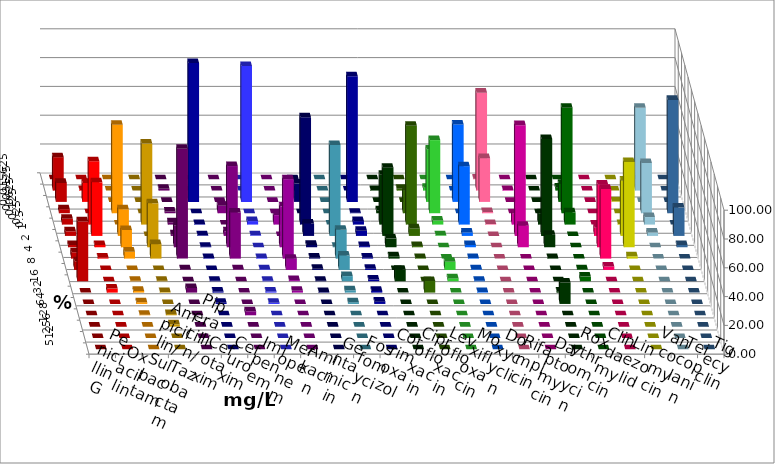
| Category | Penicillin G | Oxacillin | Ampicillin/ Sulbactam | Piperacillin/ Tazobactam | Cefotaxim | Cefuroxim | Imipenem | Meropenem | Amikacin | Gentamicin | Fosfomycin | Cotrimoxazol | Ciprofloxacin | Levofloxacin | Moxifloxacin | Doxycyclin | Rifampicin | Daptomycin | Roxythromycin | Clindamycin | Linezolid | Vancomycin | Teicoplanin | Tigecyclin |
|---|---|---|---|---|---|---|---|---|---|---|---|---|---|---|---|---|---|---|---|---|---|---|---|---|
| 0.015625 | 0 | 0 | 0 | 0 | 0 | 0 | 0 | 0 | 0 | 0 | 0 | 0 | 0 | 0 | 0 | 0 | 0.4 | 0 | 0 | 0 | 0 | 0 | 0 | 0 |
| 0.03125 | 23.2 | 0.4 | 0 | 0 | 1.205 | 0 | 0 | 0 | 0 | 0 | 0 | 0 | 0.402 | 1.205 | 2 | 0 | 68 | 0.405 | 0 | 2.024 | 0 | 0 | 0 | 57.43 |
| 0.0625 | 13.2 | 13.2 | 0 | 0 | 0 | 0 | 96.4 | 94.378 | 0 | 12.757 | 0 | 87.2 | 0 | 0 | 36.4 | 53.815 | 30.4 | 0 | 0 | 12.551 | 0 | 0.4 | 0 | 0 |
| 0.125 | 2.8 | 0 | 61.446 | 0 | 1.205 | 5.2 | 0 | 0 | 0 | 0 | 0 | 0.4 | 2.008 | 15.663 | 50.8 | 0 | 0.8 | 0 | 0 | 73.279 | 0 | 0 | 78.715 | 34.94 |
| 0.25 | 4 | 44 | 0 | 56.225 | 1.606 | 0 | 0.4 | 2.41 | 6.584 | 74.486 | 0 | 2.4 | 34.538 | 68.675 | 2.8 | 40.562 | 0.4 | 7.692 | 7.851 | 8.502 | 0 | 0.4 | 0 | 5.221 |
| 0.5 | 3.2 | 37.2 | 18.474 | 0 | 1.205 | 3.2 | 0.4 | 0.402 | 0 | 8.642 | 63.2 | 3.6 | 47.39 | 5.221 | 0.4 | 2.41 | 0 | 76.923 | 67.355 | 0 | 5.6 | 38.4 | 19.679 | 2.41 |
| 1.0 | 1.6 | 1.6 | 12.048 | 30.522 | 14.859 | 56.4 | 0.4 | 0 | 28.395 | 1.646 | 0.4 | 0.8 | 6.024 | 0.803 | 0 | 1.606 | 0 | 14.98 | 8.678 | 0 | 43.6 | 59.2 | 1.606 | 0 |
| 2.0 | 4.4 | 0.8 | 4.819 | 10.04 | 76.305 | 32 | 0.4 | 0.402 | 55.144 | 0.823 | 20 | 0.8 | 1.606 | 0.402 | 0 | 0.402 | 0 | 0 | 0.413 | 0 | 48.4 | 1.6 | 0 | 0 |
| 4.0 | 6 | 0 | 0 | 0 | 0.402 | 0.4 | 0 | 0.402 | 7.819 | 0.823 | 10 | 0.8 | 0 | 0 | 5.6 | 0.402 | 0 | 0 | 0 | 0.405 | 2.4 | 0 | 0 | 0 |
| 8.0 | 41.6 | 0 | 0.402 | 0.402 | 0 | 0 | 0.4 | 0.402 | 0.823 | 0.412 | 3.6 | 1.2 | 8.032 | 0 | 2 | 0.402 | 0 | 0 | 0 | 3.239 | 0 | 0 | 0 | 0 |
| 16.0 | 0 | 2.8 | 1.205 | 0.402 | 3.213 | 0 | 0.8 | 0.803 | 1.235 | 0.412 | 1.6 | 1.2 | 0 | 8.032 | 0 | 0.402 | 0 | 0 | 0.826 | 0 | 0 | 0 | 0 | 0 |
| 32.0 | 0 | 0 | 1.205 | 0 | 0 | 0 | 0.8 | 0.803 | 0 | 0 | 1.2 | 1.6 | 0 | 0 | 0 | 0 | 0 | 0 | 14.876 | 0 | 0 | 0 | 0 | 0 |
| 64.0 | 0 | 0 | 0.402 | 0.803 | 0 | 2.8 | 0 | 0 | 0 | 0 | 0 | 0 | 0 | 0 | 0 | 0 | 0 | 0 | 0 | 0 | 0 | 0 | 0 | 0 |
| 128.0 | 0 | 0 | 0 | 1.606 | 0 | 0 | 0 | 0 | 0 | 0 | 0 | 0 | 0 | 0 | 0 | 0 | 0 | 0 | 0 | 0 | 0 | 0 | 0 | 0 |
| 256.0 | 0 | 0 | 0 | 0 | 0 | 0 | 0 | 0 | 0 | 0 | 0 | 0 | 0 | 0 | 0 | 0 | 0 | 0 | 0 | 0 | 0 | 0 | 0 | 0 |
| 512.0 | 0 | 0 | 0 | 0 | 0 | 0 | 0 | 0 | 0 | 0 | 0 | 0 | 0 | 0 | 0 | 0 | 0 | 0 | 0 | 0 | 0 | 0 | 0 | 0 |